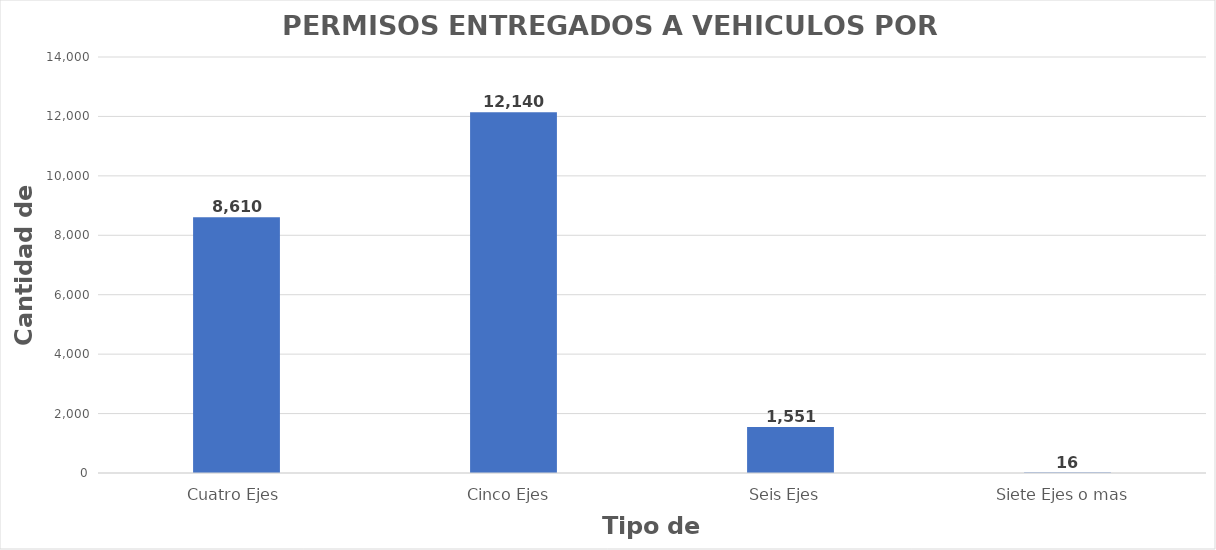
| Category | Series 0 |
|---|---|
| Cuatro Ejes | 8610 |
| Cinco Ejes  | 12140 |
| Seis Ejes  | 1551 |
| Siete Ejes o mas  | 16 |